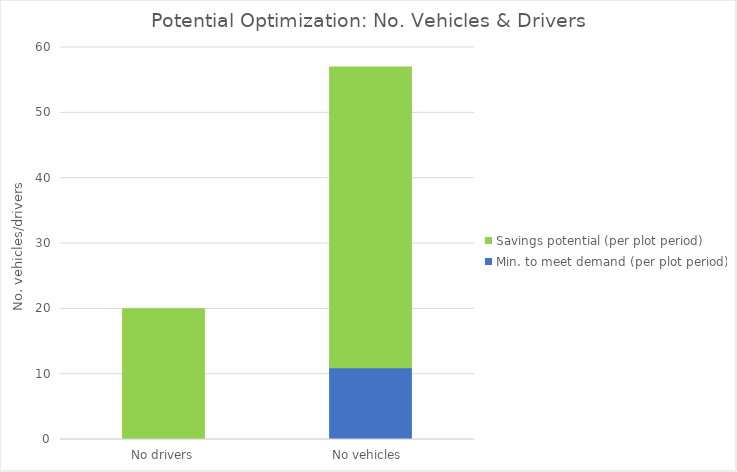
| Category | Min. to meet demand (per plot period) | Savings potential (per plot period) |
|---|---|---|
| No drivers | 0 | 20 |
| No vehicles  | 11 | 46 |